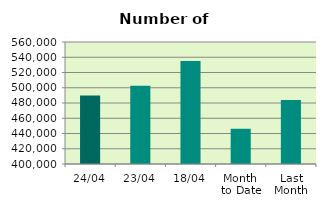
| Category | Series 0 |
|---|---|
| 24/04 | 489718 |
| 23/04 | 502486 |
| 18/04 | 535038 |
| Month 
to Date | 446222.375 |
| Last
Month | 483948.286 |